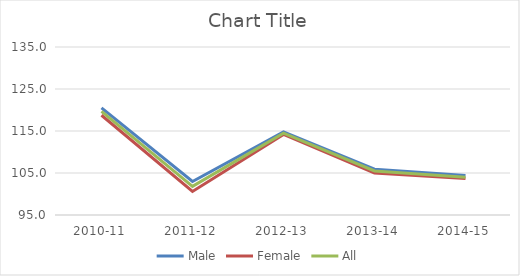
| Category | Male | Female | All |
|---|---|---|---|
| 2010-11 | 120.506 | 118.746 | 119.652 |
| 2011-12 | 102.983 | 100.593 | 101.812 |
| 2012-13 | 114.8 | 114.2 | 114.5 |
| 2013-14 | 105.9 | 105 | 105.5 |
| 2014-15 | 104.4 | 103.7 | 104 |